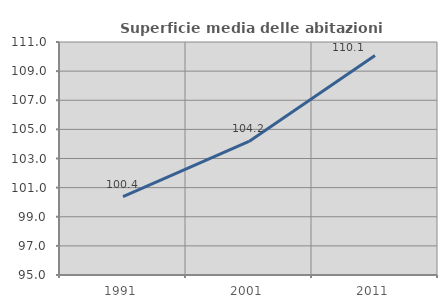
| Category | Superficie media delle abitazioni occupate |
|---|---|
| 1991.0 | 100.385 |
| 2001.0 | 104.168 |
| 2011.0 | 110.078 |